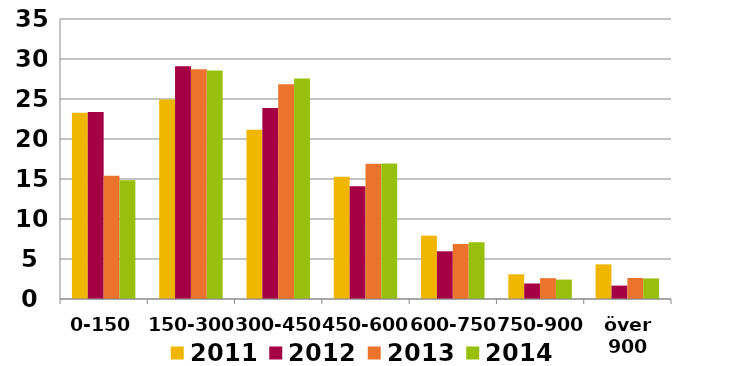
| Category | 2011 | 2012 | 2013 | 2014 |
|---|---|---|---|---|
| 0-150 | 23.274 | 23.365 | 15.412 | 14.848 |
| 150-300 | 24.927 | 29.106 | 28.723 | 28.554 |
| 300-450 | 21.17 | 23.867 | 26.857 | 27.563 |
| 450-600 | 15.292 | 14.09 | 16.907 | 16.929 |
| 600-750 | 7.92 | 5.961 | 6.872 | 7.108 |
| 750-900 | 3.085 | 1.941 | 2.604 | 2.427 |
| över 900 | 4.331 | 1.671 | 2.625 | 2.572 |